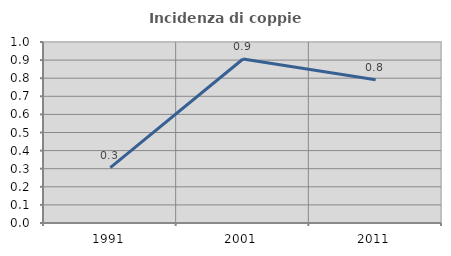
| Category | Incidenza di coppie miste |
|---|---|
| 1991.0 | 0.306 |
| 2001.0 | 0.906 |
| 2011.0 | 0.792 |